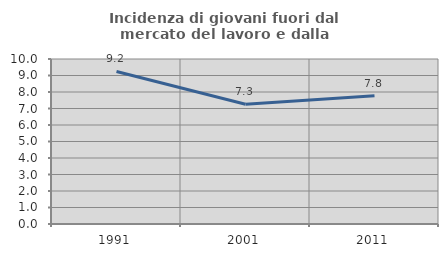
| Category | Incidenza di giovani fuori dal mercato del lavoro e dalla formazione  |
|---|---|
| 1991.0 | 9.246 |
| 2001.0 | 7.253 |
| 2011.0 | 7.768 |